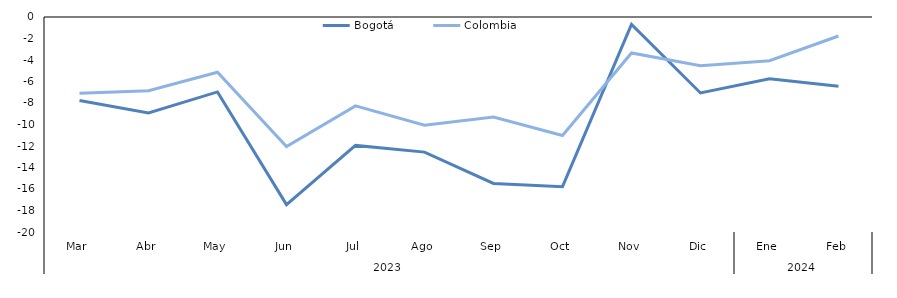
| Category | Bogotá | Colombia |
|---|---|---|
| 0 | -7.777 | -7.097 |
| 1 | -8.932 | -6.859 |
| 2 | -6.969 | -5.134 |
| 3 | -17.451 | -12.046 |
| 4 | -11.946 | -8.272 |
| 5 | -12.567 | -10.073 |
| 6 | -15.486 | -9.305 |
| 7 | -15.784 | -11.027 |
| 8 | -0.689 | -3.342 |
| 9 | -7.066 | -4.542 |
| 10 | -5.753 | -4.06 |
| 11 | -6.438 | -1.768 |